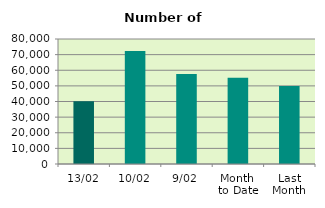
| Category | Series 0 |
|---|---|
| 13/02 | 40100 |
| 10/02 | 72244 |
| 9/02 | 57580 |
| Month 
to Date | 55166.444 |
| Last
Month | 49894.952 |